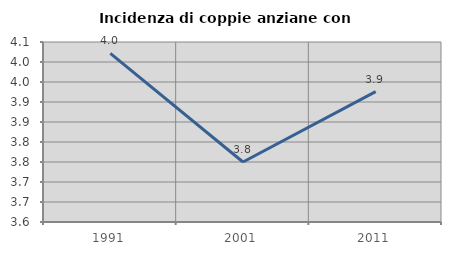
| Category | Incidenza di coppie anziane con figli |
|---|---|
| 1991.0 | 4.022 |
| 2001.0 | 3.75 |
| 2011.0 | 3.926 |